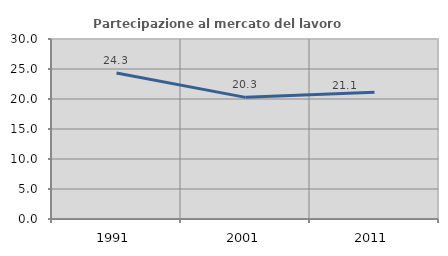
| Category | Partecipazione al mercato del lavoro  femminile |
|---|---|
| 1991.0 | 24.346 |
| 2001.0 | 20.272 |
| 2011.0 | 21.12 |